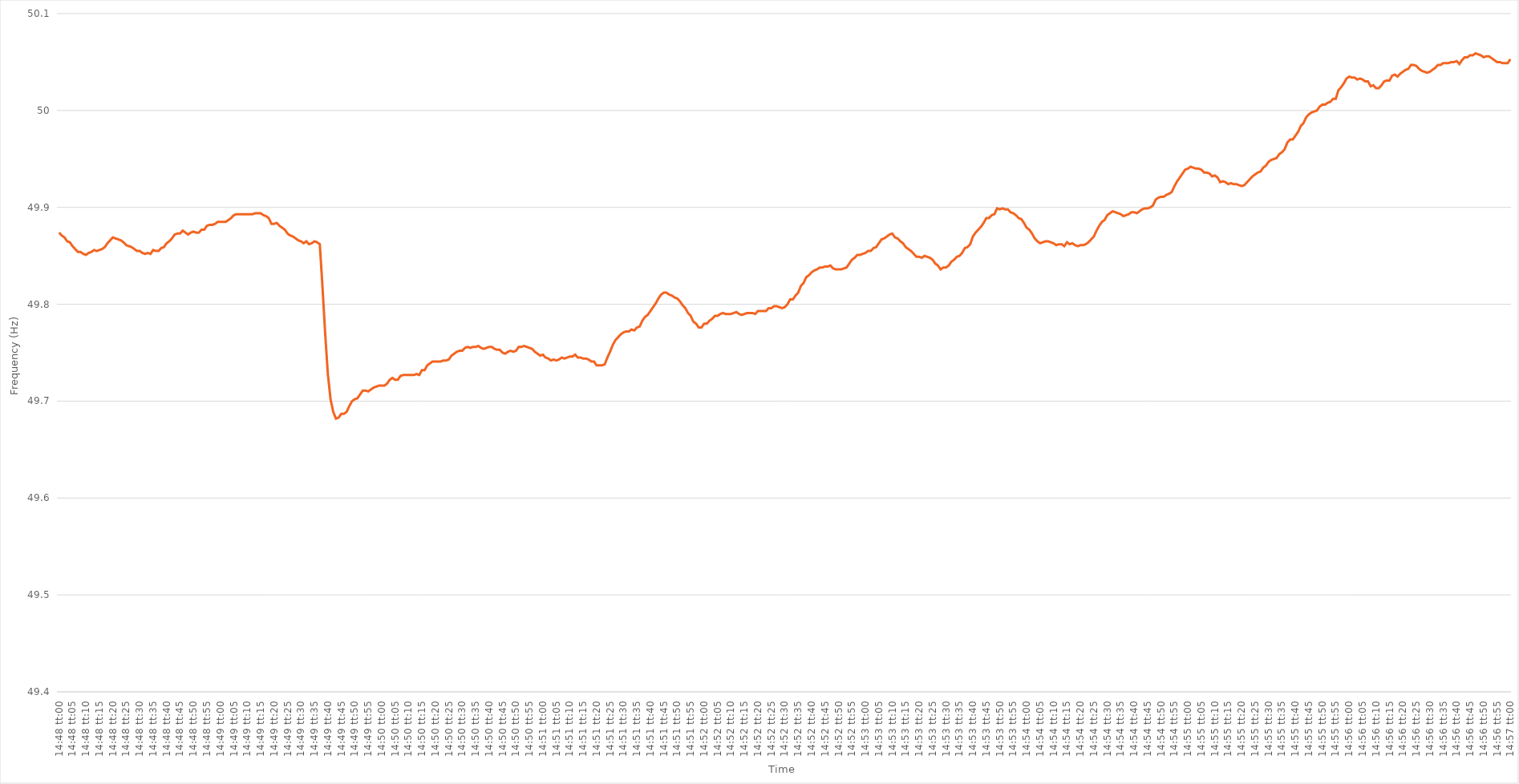
| Category | Series 0 |
|---|---|
| 0.6166666666666667 | 49.874 |
| 0.6166782407407407 | 49.871 |
| 0.6166898148148149 | 49.869 |
| 0.6167013888888889 | 49.865 |
| 0.616712962962963 | 49.864 |
| 0.616724537037037 | 49.86 |
| 0.616736111111111 | 49.857 |
| 0.6167476851851852 | 49.854 |
| 0.6167592592592592 | 49.854 |
| 0.6167708333333334 | 49.852 |
| 0.6167824074074074 | 49.851 |
| 0.6167939814814815 | 49.853 |
| 0.6168055555555555 | 49.854 |
| 0.6168171296296296 | 49.856 |
| 0.6168287037037037 | 49.855 |
| 0.6168402777777778 | 49.856 |
| 0.6168518518518519 | 49.857 |
| 0.6168634259259259 | 49.859 |
| 0.616875 | 49.863 |
| 0.6168865740740741 | 49.866 |
| 0.6168981481481481 | 49.869 |
| 0.6169097222222223 | 49.868 |
| 0.6169212962962963 | 49.867 |
| 0.6169328703703704 | 49.866 |
| 0.6169444444444444 | 49.864 |
| 0.6169560185185184 | 49.861 |
| 0.6169675925925926 | 49.86 |
| 0.6169791666666666 | 49.859 |
| 0.6169907407407408 | 49.857 |
| 0.6170023148148148 | 49.855 |
| 0.6170138888888889 | 49.855 |
| 0.6170254629629629 | 49.853 |
| 0.617037037037037 | 49.852 |
| 0.6170486111111111 | 49.853 |
| 0.6170601851851852 | 49.852 |
| 0.6170717592592593 | 49.856 |
| 0.6170833333333333 | 49.855 |
| 0.6170949074074074 | 49.855 |
| 0.6171064814814815 | 49.858 |
| 0.6171180555555555 | 49.859 |
| 0.6171296296296297 | 49.863 |
| 0.6171412037037037 | 49.865 |
| 0.6171527777777778 | 49.868 |
| 0.6171643518518518 | 49.872 |
| 0.617175925925926 | 49.873 |
| 0.6171875 | 49.873 |
| 0.617199074074074 | 49.876 |
| 0.6172106481481482 | 49.874 |
| 0.6172222222222222 | 49.872 |
| 0.6172337962962963 | 49.874 |
| 0.6172453703703703 | 49.875 |
| 0.6172569444444445 | 49.874 |
| 0.6172685185185185 | 49.874 |
| 0.6172800925925926 | 49.877 |
| 0.6172916666666667 | 49.877 |
| 0.6173032407407407 | 49.881 |
| 0.6173148148148148 | 49.882 |
| 0.6173263888888889 | 49.882 |
| 0.617337962962963 | 49.883 |
| 0.6173495370370371 | 49.885 |
| 0.6173611111111111 | 49.885 |
| 0.6173726851851852 | 49.885 |
| 0.6173842592592592 | 49.885 |
| 0.6173958333333334 | 49.887 |
| 0.6174074074074074 | 49.889 |
| 0.6174189814814816 | 49.892 |
| 0.6174305555555556 | 49.893 |
| 0.6174421296296296 | 49.893 |
| 0.6174537037037037 | 49.893 |
| 0.6174652777777777 | 49.893 |
| 0.6174768518518519 | 49.893 |
| 0.6174884259259259 | 49.893 |
| 0.6175 | 49.893 |
| 0.6175115740740741 | 49.894 |
| 0.6175231481481481 | 49.894 |
| 0.6175347222222222 | 49.894 |
| 0.6175462962962963 | 49.892 |
| 0.6175578703703704 | 49.891 |
| 0.6175694444444445 | 49.889 |
| 0.6175810185185185 | 49.883 |
| 0.6175925925925926 | 49.883 |
| 0.6176041666666666 | 49.884 |
| 0.6176157407407408 | 49.881 |
| 0.6176273148148148 | 49.879 |
| 0.617638888888889 | 49.877 |
| 0.617650462962963 | 49.873 |
| 0.617662037037037 | 49.871 |
| 0.6176736111111111 | 49.87 |
| 0.6176851851851851 | 49.868 |
| 0.6176967592592593 | 49.866 |
| 0.6177083333333333 | 49.865 |
| 0.6177199074074075 | 49.863 |
| 0.6177314814814815 | 49.865 |
| 0.6177430555555555 | 49.862 |
| 0.6177546296296296 | 49.863 |
| 0.6177662037037037 | 49.865 |
| 0.6177777777777778 | 49.864 |
| 0.6177893518518519 | 49.862 |
| 0.617800925925926 | 49.818 |
| 0.6178125 | 49.77 |
| 0.617824074074074 | 49.728 |
| 0.6178356481481482 | 49.702 |
| 0.6178472222222222 | 49.689 |
| 0.6178587962962964 | 49.682 |
| 0.6178703703703704 | 49.683 |
| 0.6178819444444444 | 49.687 |
| 0.6178935185185185 | 49.687 |
| 0.6179050925925925 | 49.689 |
| 0.6179166666666667 | 49.695 |
| 0.6179282407407407 | 49.7 |
| 0.6179398148148149 | 49.702 |
| 0.6179513888888889 | 49.703 |
| 0.6179629629629629 | 49.707 |
| 0.617974537037037 | 49.711 |
| 0.6179861111111111 | 49.711 |
| 0.6179976851851852 | 49.71 |
| 0.6180092592592593 | 49.712 |
| 0.6180208333333334 | 49.714 |
| 0.6180324074074074 | 49.715 |
| 0.6180439814814814 | 49.716 |
| 0.6180555555555556 | 49.716 |
| 0.6180671296296296 | 49.716 |
| 0.6180787037037038 | 49.718 |
| 0.6180902777777778 | 49.722 |
| 0.6181018518518518 | 49.724 |
| 0.6181134259259259 | 49.722 |
| 0.618125 | 49.722 |
| 0.6181365740740741 | 49.726 |
| 0.6181481481481481 | 49.727 |
| 0.6181597222222223 | 49.727 |
| 0.6181712962962963 | 49.727 |
| 0.6181828703703703 | 49.727 |
| 0.6181944444444444 | 49.727 |
| 0.6182060185185185 | 49.728 |
| 0.6182175925925926 | 49.727 |
| 0.6182291666666667 | 49.732 |
| 0.6182407407407408 | 49.732 |
| 0.6182523148148148 | 49.737 |
| 0.6182638888888888 | 49.739 |
| 0.618275462962963 | 49.741 |
| 0.618287037037037 | 49.741 |
| 0.6182986111111112 | 49.741 |
| 0.6183101851851852 | 49.741 |
| 0.6183217592592593 | 49.742 |
| 0.6183333333333333 | 49.742 |
| 0.6183449074074074 | 49.743 |
| 0.6183564814814815 | 49.747 |
| 0.6183680555555556 | 49.749 |
| 0.6183796296296297 | 49.751 |
| 0.6183912037037037 | 49.752 |
| 0.6184027777777777 | 49.752 |
| 0.6184143518518518 | 49.755 |
| 0.6184259259259259 | 49.756 |
| 0.6184375 | 49.755 |
| 0.6184490740740741 | 49.756 |
| 0.6184606481481482 | 49.756 |
| 0.6184722222222222 | 49.757 |
| 0.6184837962962962 | 49.755 |
| 0.6184953703703704 | 49.754 |
| 0.6185069444444444 | 49.755 |
| 0.6185185185185186 | 49.756 |
| 0.6185300925925926 | 49.756 |
| 0.6185416666666667 | 49.754 |
| 0.6185532407407407 | 49.753 |
| 0.6185648148148148 | 49.753 |
| 0.6185763888888889 | 49.75 |
| 0.618587962962963 | 49.749 |
| 0.6185995370370371 | 49.751 |
| 0.6186111111111111 | 49.752 |
| 0.6186226851851852 | 49.751 |
| 0.6186342592592592 | 49.752 |
| 0.6186458333333333 | 49.756 |
| 0.6186574074074074 | 49.756 |
| 0.6186689814814815 | 49.757 |
| 0.6186805555555556 | 49.756 |
| 0.6186921296296296 | 49.755 |
| 0.6187037037037036 | 49.754 |
| 0.6187152777777778 | 49.751 |
| 0.6187268518518518 | 49.749 |
| 0.618738425925926 | 49.747 |
| 0.61875 | 49.748 |
| 0.6187615740740741 | 49.745 |
| 0.6187731481481481 | 49.744 |
| 0.6187847222222222 | 49.742 |
| 0.6187962962962963 | 49.743 |
| 0.6188078703703704 | 49.742 |
| 0.6188194444444445 | 49.743 |
| 0.6188310185185185 | 49.745 |
| 0.6188425925925926 | 49.744 |
| 0.6188541666666666 | 49.745 |
| 0.6188657407407407 | 49.746 |
| 0.6188773148148148 | 49.746 |
| 0.6188888888888889 | 49.748 |
| 0.618900462962963 | 49.745 |
| 0.618912037037037 | 49.745 |
| 0.618923611111111 | 49.744 |
| 0.6189351851851852 | 49.744 |
| 0.6189467592592592 | 49.743 |
| 0.6189583333333334 | 49.741 |
| 0.6189699074074074 | 49.741 |
| 0.6189814814814815 | 49.737 |
| 0.6189930555555555 | 49.737 |
| 0.6190046296296297 | 49.737 |
| 0.6190162037037037 | 49.738 |
| 0.6190277777777778 | 49.745 |
| 0.6190393518518519 | 49.751 |
| 0.6190509259259259 | 49.758 |
| 0.6190625 | 49.763 |
| 0.6190740740740741 | 49.766 |
| 0.6190856481481481 | 49.769 |
| 0.6190972222222222 | 49.771 |
| 0.6191087962962963 | 49.772 |
| 0.6191203703703704 | 49.772 |
| 0.6191319444444444 | 49.774 |
| 0.6191435185185185 | 49.773 |
| 0.6191550925925926 | 49.776 |
| 0.6191666666666666 | 49.777 |
| 0.6191782407407408 | 49.783 |
| 0.6191898148148148 | 49.787 |
| 0.6192013888888889 | 49.789 |
| 0.6192129629629629 | 49.793 |
| 0.6192245370370371 | 49.797 |
| 0.6192361111111111 | 49.801 |
| 0.6192476851851852 | 49.806 |
| 0.6192592592592593 | 49.81 |
| 0.6192708333333333 | 49.812 |
| 0.6192824074074074 | 49.812 |
| 0.6192939814814815 | 49.81 |
| 0.6193055555555556 | 49.809 |
| 0.6193171296296297 | 49.807 |
| 0.6193287037037037 | 49.806 |
| 0.6193402777777778 | 49.803 |
| 0.6193518518518518 | 49.799 |
| 0.6193634259259259 | 49.796 |
| 0.619375 | 49.791 |
| 0.619386574074074 | 49.788 |
| 0.6193981481481482 | 49.782 |
| 0.6194097222222222 | 49.78 |
| 0.6194212962962963 | 49.776 |
| 0.6194328703703703 | 49.776 |
| 0.6194444444444445 | 49.78 |
| 0.6194560185185185 | 49.78 |
| 0.6194675925925927 | 49.783 |
| 0.6194791666666667 | 49.785 |
| 0.6194907407407407 | 49.788 |
| 0.6195023148148148 | 49.788 |
| 0.6195138888888889 | 49.79 |
| 0.619525462962963 | 49.791 |
| 0.6195370370370371 | 49.79 |
| 0.6195486111111111 | 49.79 |
| 0.6195601851851852 | 49.79 |
| 0.6195717592592592 | 49.791 |
| 0.6195833333333333 | 49.792 |
| 0.6195949074074074 | 49.79 |
| 0.6196064814814815 | 49.789 |
| 0.6196180555555556 | 49.79 |
| 0.6196296296296296 | 49.791 |
| 0.6196412037037037 | 49.791 |
| 0.6196527777777777 | 49.791 |
| 0.6196643518518519 | 49.79 |
| 0.6196759259259259 | 49.793 |
| 0.6196875000000001 | 49.793 |
| 0.6196990740740741 | 49.793 |
| 0.6197106481481481 | 49.793 |
| 0.6197222222222222 | 49.796 |
| 0.6197337962962963 | 49.796 |
| 0.6197453703703704 | 49.798 |
| 0.6197569444444445 | 49.798 |
| 0.6197685185185186 | 49.797 |
| 0.6197800925925926 | 49.796 |
| 0.6197916666666666 | 49.797 |
| 0.6198032407407407 | 49.8 |
| 0.6198148148148148 | 49.805 |
| 0.6198263888888889 | 49.805 |
| 0.619837962962963 | 49.809 |
| 0.619849537037037 | 49.812 |
| 0.6198611111111111 | 49.819 |
| 0.6198726851851851 | 49.822 |
| 0.6198842592592593 | 49.828 |
| 0.6198958333333333 | 49.83 |
| 0.6199074074074075 | 49.833 |
| 0.6199189814814815 | 49.835 |
| 0.6199305555555555 | 49.836 |
| 0.6199421296296296 | 49.838 |
| 0.6199537037037037 | 49.838 |
| 0.6199652777777778 | 49.839 |
| 0.6199768518518519 | 49.839 |
| 0.619988425925926 | 49.84 |
| 0.62 | 49.837 |
| 0.620011574074074 | 49.836 |
| 0.6200231481481482 | 49.836 |
| 0.6200347222222222 | 49.836 |
| 0.6200462962962963 | 49.837 |
| 0.6200578703703704 | 49.838 |
| 0.6200694444444445 | 49.842 |
| 0.6200810185185185 | 49.846 |
| 0.6200925925925925 | 49.848 |
| 0.6201041666666667 | 49.851 |
| 0.6201157407407407 | 49.851 |
| 0.6201273148148149 | 49.852 |
| 0.6201388888888889 | 49.853 |
| 0.620150462962963 | 49.855 |
| 0.620162037037037 | 49.855 |
| 0.6201736111111111 | 49.858 |
| 0.6201851851851852 | 49.859 |
| 0.6201967592592593 | 49.863 |
| 0.6202083333333334 | 49.867 |
| 0.6202199074074074 | 49.868 |
| 0.6202314814814814 | 49.87 |
| 0.6202430555555556 | 49.872 |
| 0.6202546296296296 | 49.873 |
| 0.6202662037037037 | 49.869 |
| 0.6202777777777778 | 49.868 |
| 0.6202893518518519 | 49.865 |
| 0.6203009259259259 | 49.863 |
| 0.6203124999999999 | 49.859 |
| 0.6203240740740741 | 49.857 |
| 0.6203356481481481 | 49.855 |
| 0.6203472222222223 | 49.852 |
| 0.6203587962962963 | 49.849 |
| 0.6203703703703703 | 49.849 |
| 0.6203819444444444 | 49.848 |
| 0.6203935185185185 | 49.85 |
| 0.6204050925925926 | 49.849 |
| 0.6204166666666667 | 49.848 |
| 0.6204282407407408 | 49.846 |
| 0.6204398148148148 | 49.842 |
| 0.6204513888888888 | 49.84 |
| 0.620462962962963 | 49.836 |
| 0.620474537037037 | 49.838 |
| 0.6204861111111112 | 49.838 |
| 0.6204976851851852 | 49.84 |
| 0.6205092592592593 | 49.844 |
| 0.6205208333333333 | 49.846 |
| 0.6205324074074073 | 49.849 |
| 0.6205439814814815 | 49.85 |
| 0.6205555555555555 | 49.853 |
| 0.6205671296296297 | 49.858 |
| 0.6205787037037037 | 49.859 |
| 0.6205902777777778 | 49.862 |
| 0.6206018518518518 | 49.87 |
| 0.6206134259259259 | 49.874 |
| 0.620625 | 49.877 |
| 0.6206365740740741 | 49.88 |
| 0.6206481481481482 | 49.884 |
| 0.6206597222222222 | 49.889 |
| 0.6206712962962962 | 49.889 |
| 0.6206828703703704 | 49.892 |
| 0.6206944444444444 | 49.893 |
| 0.6207060185185186 | 49.899 |
| 0.6207175925925926 | 49.898 |
| 0.6207291666666667 | 49.899 |
| 0.6207407407407407 | 49.898 |
| 0.6207523148148147 | 49.898 |
| 0.6207638888888889 | 49.895 |
| 0.6207754629629629 | 49.894 |
| 0.6207870370370371 | 49.892 |
| 0.6207986111111111 | 49.889 |
| 0.6208101851851852 | 49.888 |
| 0.6208217592592592 | 49.884 |
| 0.6208333333333333 | 49.879 |
| 0.6208449074074074 | 49.877 |
| 0.6208564814814815 | 49.873 |
| 0.6208680555555556 | 49.868 |
| 0.6208796296296296 | 49.865 |
| 0.6208912037037037 | 49.863 |
| 0.6209027777777778 | 49.864 |
| 0.6209143518518518 | 49.865 |
| 0.620925925925926 | 49.865 |
| 0.6209375 | 49.864 |
| 0.6209490740740741 | 49.863 |
| 0.6209606481481481 | 49.861 |
| 0.6209722222222223 | 49.862 |
| 0.6209837962962963 | 49.862 |
| 0.6209953703703703 | 49.86 |
| 0.6210069444444445 | 49.864 |
| 0.6210185185185185 | 49.862 |
| 0.6210300925925926 | 49.863 |
| 0.6210416666666666 | 49.861 |
| 0.6210532407407408 | 49.86 |
| 0.6210648148148148 | 49.861 |
| 0.6210763888888889 | 49.861 |
| 0.621087962962963 | 49.862 |
| 0.621099537037037 | 49.864 |
| 0.6211111111111111 | 49.867 |
| 0.6211226851851852 | 49.87 |
| 0.6211342592592592 | 49.876 |
| 0.6211458333333334 | 49.881 |
| 0.6211574074074074 | 49.885 |
| 0.6211689814814815 | 49.887 |
| 0.6211805555555555 | 49.892 |
| 0.6211921296296297 | 49.894 |
| 0.6212037037037037 | 49.896 |
| 0.6212152777777777 | 49.895 |
| 0.6212268518518519 | 49.894 |
| 0.6212384259259259 | 49.893 |
| 0.62125 | 49.891 |
| 0.621261574074074 | 49.892 |
| 0.6212731481481482 | 49.893 |
| 0.6212847222222222 | 49.895 |
| 0.6212962962962963 | 49.895 |
| 0.6213078703703704 | 49.894 |
| 0.6213194444444444 | 49.896 |
| 0.6213310185185185 | 49.898 |
| 0.6213425925925926 | 49.899 |
| 0.6213541666666667 | 49.899 |
| 0.6213657407407408 | 49.9 |
| 0.6213773148148148 | 49.902 |
| 0.6213888888888889 | 49.908 |
| 0.6214004629629629 | 49.91 |
| 0.6214120370370371 | 49.911 |
| 0.6214236111111111 | 49.911 |
| 0.6214351851851853 | 49.913 |
| 0.6214467592592593 | 49.914 |
| 0.6214583333333333 | 49.916 |
| 0.6214699074074074 | 49.922 |
| 0.6214814814814814 | 49.927 |
| 0.6214930555555556 | 49.931 |
| 0.6215046296296296 | 49.935 |
| 0.6215162037037038 | 49.939 |
| 0.6215277777777778 | 49.94 |
| 0.6215393518518518 | 49.942 |
| 0.6215509259259259 | 49.941 |
| 0.6215625 | 49.94 |
| 0.6215740740740741 | 49.94 |
| 0.6215856481481482 | 49.939 |
| 0.6215972222222222 | 49.936 |
| 0.6216087962962963 | 49.936 |
| 0.6216203703703703 | 49.935 |
| 0.6216319444444445 | 49.932 |
| 0.6216435185185185 | 49.933 |
| 0.6216550925925927 | 49.931 |
| 0.6216666666666667 | 49.926 |
| 0.6216782407407407 | 49.927 |
| 0.6216898148148148 | 49.926 |
| 0.6217013888888888 | 49.924 |
| 0.621712962962963 | 49.925 |
| 0.621724537037037 | 49.924 |
| 0.6217361111111112 | 49.924 |
| 0.6217476851851852 | 49.923 |
| 0.6217592592592592 | 49.922 |
| 0.6217708333333333 | 49.923 |
| 0.6217824074074074 | 49.926 |
| 0.6217939814814815 | 49.929 |
| 0.6218055555555556 | 49.932 |
| 0.6218171296296297 | 49.934 |
| 0.6218287037037037 | 49.936 |
| 0.6218402777777777 | 49.937 |
| 0.6218518518518519 | 49.941 |
| 0.6218634259259259 | 49.943 |
| 0.6218750000000001 | 49.947 |
| 0.6218865740740741 | 49.949 |
| 0.6218981481481481 | 49.95 |
| 0.6219097222222222 | 49.951 |
| 0.6219212962962963 | 49.955 |
| 0.6219328703703704 | 49.957 |
| 0.6219444444444444 | 49.96 |
| 0.6219560185185186 | 49.967 |
| 0.6219675925925926 | 49.97 |
| 0.6219791666666666 | 49.97 |
| 0.6219907407407407 | 49.974 |
| 0.6220023148148148 | 49.978 |
| 0.6220138888888889 | 49.984 |
| 0.622025462962963 | 49.987 |
| 0.622037037037037 | 49.993 |
| 0.6220486111111111 | 49.996 |
| 0.6220601851851851 | 49.998 |
| 0.6220717592592593 | 49.999 |
| 0.6220833333333333 | 50 |
| 0.6220949074074075 | 50.004 |
| 0.6221064814814815 | 50.006 |
| 0.6221180555555555 | 50.006 |
| 0.6221296296296296 | 50.008 |
| 0.6221412037037037 | 50.009 |
| 0.6221527777777778 | 50.012 |
| 0.6221643518518518 | 50.012 |
| 0.622175925925926 | 50.021 |
| 0.6221875 | 50.024 |
| 0.622199074074074 | 50.028 |
| 0.6222106481481481 | 50.033 |
| 0.6222222222222222 | 50.035 |
| 0.6222337962962963 | 50.034 |
| 0.6222453703703704 | 50.034 |
| 0.6222569444444445 | 50.032 |
| 0.6222685185185185 | 50.033 |
| 0.6222800925925925 | 50.032 |
| 0.6222916666666667 | 50.03 |
| 0.6223032407407407 | 50.03 |
| 0.6223148148148149 | 50.025 |
| 0.6223263888888889 | 50.026 |
| 0.622337962962963 | 50.023 |
| 0.622349537037037 | 50.023 |
| 0.6223611111111111 | 50.026 |
| 0.6223726851851852 | 50.03 |
| 0.6223842592592593 | 50.031 |
| 0.6223958333333334 | 50.031 |
| 0.6224074074074074 | 50.036 |
| 0.6224189814814814 | 50.037 |
| 0.6224305555555555 | 50.035 |
| 0.6224421296296296 | 50.038 |
| 0.6224537037037037 | 50.04 |
| 0.6224652777777778 | 50.042 |
| 0.6224768518518519 | 50.043 |
| 0.6224884259259259 | 50.047 |
| 0.6224999999999999 | 50.047 |
| 0.6225115740740741 | 50.046 |
| 0.6225231481481481 | 50.043 |
| 0.6225347222222223 | 50.041 |
| 0.6225462962962963 | 50.04 |
| 0.6225578703703704 | 50.039 |
| 0.6225694444444444 | 50.04 |
| 0.6225810185185185 | 50.042 |
| 0.6225925925925926 | 50.044 |
| 0.6226041666666667 | 50.047 |
| 0.6226157407407408 | 50.047 |
| 0.6226273148148148 | 50.049 |
| 0.6226388888888889 | 50.049 |
| 0.6226504629629629 | 50.049 |
| 0.622662037037037 | 50.05 |
| 0.6226736111111111 | 50.05 |
| 0.6226851851851852 | 50.051 |
| 0.6226967592592593 | 50.048 |
| 0.6227083333333333 | 50.052 |
| 0.6227199074074073 | 50.055 |
| 0.6227314814814815 | 50.055 |
| 0.6227430555555555 | 50.057 |
| 0.6227546296296297 | 50.057 |
| 0.6227662037037037 | 50.059 |
| 0.6227777777777778 | 50.058 |
| 0.6227893518518518 | 50.057 |
| 0.622800925925926 | 50.055 |
| 0.6228125 | 50.056 |
| 0.6228240740740741 | 50.056 |
| 0.6228356481481482 | 50.054 |
| 0.6228472222222222 | 50.052 |
| 0.6228587962962963 | 50.05 |
| 0.6228703703703703 | 50.05 |
| 0.6228819444444444 | 50.049 |
| 0.6228935185185185 | 50.049 |
| 0.6229050925925926 | 50.049 |
| 0.6229166666666667 | 50.053 |